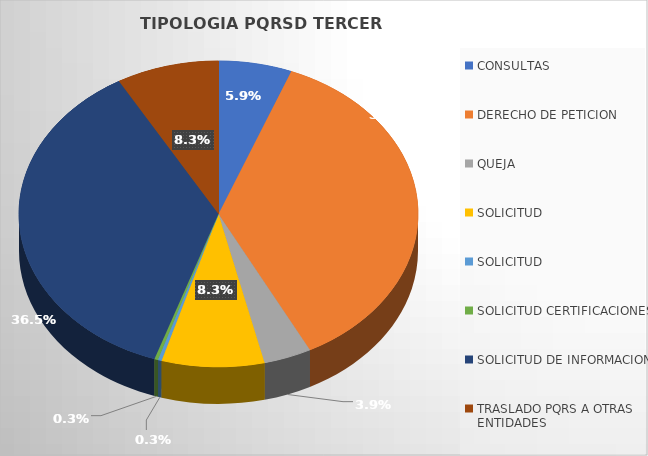
| Category | CANTIDAD |
|---|---|
| CONSULTAS | 20 |
| DERECHO DE PETICION | 123 |
| QUEJA | 13 |
| SOLICITUD | 28 |
| SOLICITUD  | 1 |
| SOLICITUD CERTIFICACIONES | 1 |
| SOLICITUD DE INFORMACION | 123 |
| TRASLADO PQRS A OTRAS ENTIDADES | 28 |